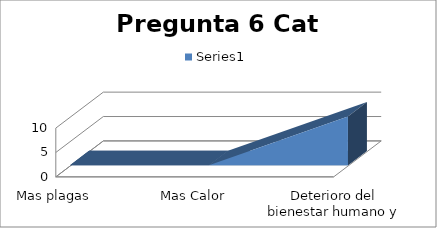
| Category | Series 0 |
|---|---|
| Mas plagas | 0 |
| Mas Calor | 0 |
| Deterioro del bienestar humano y de la naturleza | 10 |